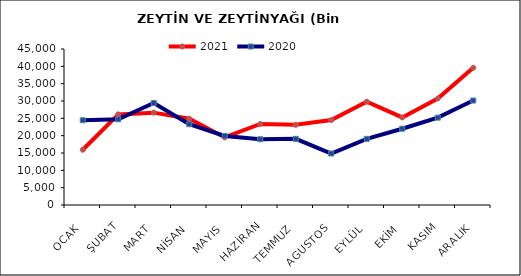
| Category | 2021 | 2020 |
|---|---|---|
| OCAK | 15943.145 | 24451.569 |
| ŞUBAT | 26135.543 | 24726.652 |
| MART | 26641.717 | 29417.073 |
| NİSAN | 24886.329 | 23301.292 |
| MAYIS | 19490.091 | 19919.669 |
| HAZİRAN | 23364.857 | 18969.294 |
| TEMMUZ | 23127.54 | 19075.408 |
| AGUSTOS | 24531.418 | 14848.67 |
| EYLÜL | 29808.309 | 19081.797 |
| EKİM | 25260.424 | 22005.577 |
| KASIM | 30724.71 | 25197.23 |
| ARALIK | 39582.74 | 30132.582 |